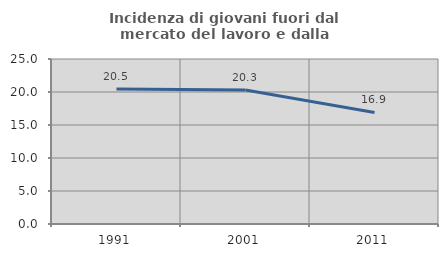
| Category | Incidenza di giovani fuori dal mercato del lavoro e dalla formazione  |
|---|---|
| 1991.0 | 20.464 |
| 2001.0 | 20.316 |
| 2011.0 | 16.908 |